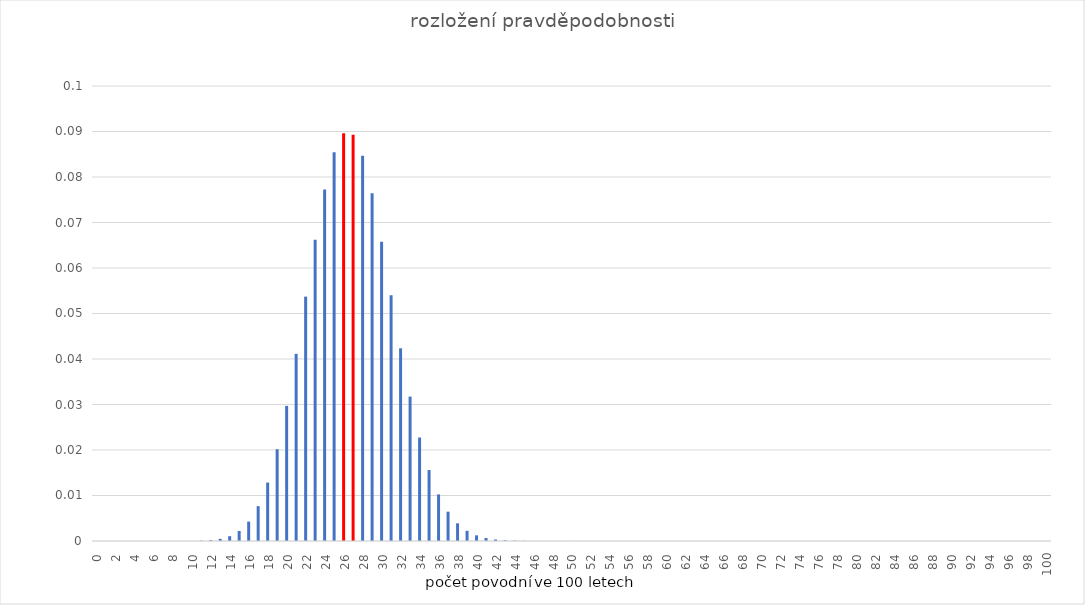
| Category | pravděpodobnost |
|---|---|
| 0.0 | 0 |
| 1.0 | 0 |
| 2.0 | 0 |
| 3.0 | 0 |
| 4.0 | 0 |
| 5.0 | 0 |
| 6.0 | 0 |
| 7.0 | 0 |
| 8.0 | 0 |
| 9.0 | 0 |
| 10.0 | 0 |
| 11.0 | 0 |
| 12.0 | 0 |
| 13.0 | 0 |
| 14.0 | 0.001 |
| 15.0 | 0.002 |
| 16.0 | 0.004 |
| 17.0 | 0.008 |
| 18.0 | 0.013 |
| 19.0 | 0.02 |
| 20.0 | 0.03 |
| 21.0 | 0.041 |
| 22.0 | 0.054 |
| 23.0 | 0.066 |
| 24.0 | 0.077 |
| 25.0 | 0.085 |
| 26.0 | 0.09 |
| 27.0 | 0.089 |
| 28.0 | 0.085 |
| 29.0 | 0.076 |
| 30.0 | 0.066 |
| 31.0 | 0.054 |
| 32.0 | 0.042 |
| 33.0 | 0.032 |
| 34.0 | 0.023 |
| 35.0 | 0.016 |
| 36.0 | 0.01 |
| 37.0 | 0.006 |
| 38.0 | 0.004 |
| 39.0 | 0.002 |
| 40.0 | 0.001 |
| 41.0 | 0.001 |
| 42.0 | 0 |
| 43.0 | 0 |
| 44.0 | 0 |
| 45.0 | 0 |
| 46.0 | 0 |
| 47.0 | 0 |
| 48.0 | 0 |
| 49.0 | 0 |
| 50.0 | 0 |
| 51.0 | 0 |
| 52.0 | 0 |
| 53.0 | 0 |
| 54.0 | 0 |
| 55.0 | 0 |
| 56.0 | 0 |
| 57.0 | 0 |
| 58.0 | 0 |
| 59.0 | 0 |
| 60.0 | 0 |
| 61.0 | 0 |
| 62.0 | 0 |
| 63.0 | 0 |
| 64.0 | 0 |
| 65.0 | 0 |
| 66.0 | 0 |
| 67.0 | 0 |
| 68.0 | 0 |
| 69.0 | 0 |
| 70.0 | 0 |
| 71.0 | 0 |
| 72.0 | 0 |
| 73.0 | 0 |
| 74.0 | 0 |
| 75.0 | 0 |
| 76.0 | 0 |
| 77.0 | 0 |
| 78.0 | 0 |
| 79.0 | 0 |
| 80.0 | 0 |
| 81.0 | 0 |
| 82.0 | 0 |
| 83.0 | 0 |
| 84.0 | 0 |
| 85.0 | 0 |
| 86.0 | 0 |
| 87.0 | 0 |
| 88.0 | 0 |
| 89.0 | 0 |
| 90.0 | 0 |
| 91.0 | 0 |
| 92.0 | 0 |
| 93.0 | 0 |
| 94.0 | 0 |
| 95.0 | 0 |
| 96.0 | 0 |
| 97.0 | 0 |
| 98.0 | 0 |
| 99.0 | 0 |
| 100.0 | 0 |